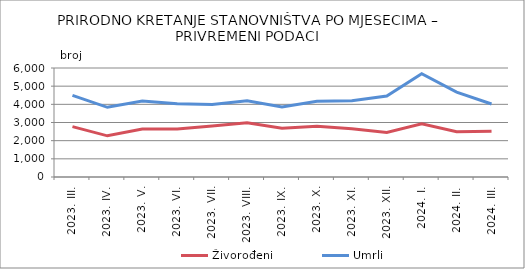
| Category | Živorođeni | Umrli |
|---|---|---|
| 2023. III. | 2771 | 4491 |
| 2023. IV. | 2266 | 3836 |
| 2023. V. | 2638 | 4179 |
| 2023. VI. | 2642 | 4034 |
| 2023. VII. | 2810 | 3993 |
| 2023. VIII. | 2982 | 4202 |
| 2023. IX. | 2683 | 3855 |
| 2023. X. | 2789 | 4167 |
| 2023. XI. | 2660 | 4202 |
| 2023. XII. | 2453 | 4455 |
| 2024. I. | 2924 | 5681 |
| 2024. II. | 2492 | 4674 |
| 2024. III. | 2518 | 4016 |